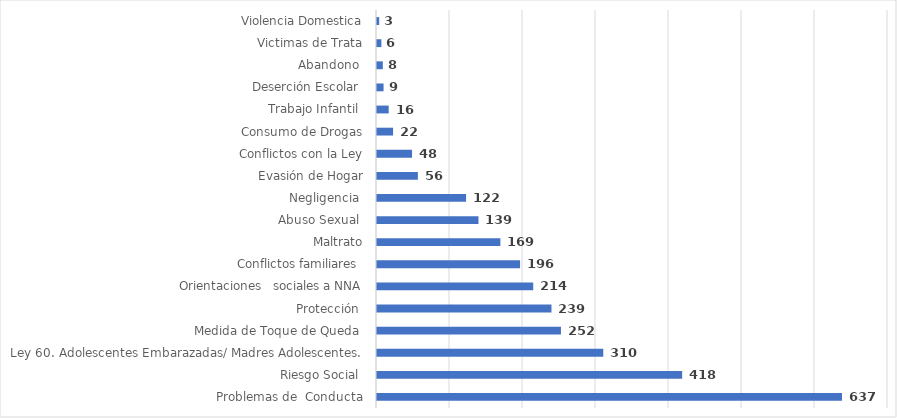
| Category | Series 0 |
|---|---|
| Problemas de  Conducta | 637 |
| Riesgo Social  | 418 |
| Ley 60. Adolescentes Embarazadas/ Madres Adolescentes. | 310 |
| Medida de Toque de Queda  | 252 |
| Protección  | 239 |
| Orientaciones   sociales a NNA | 214 |
| Conflictos familiares  | 196 |
| Maltrato | 169 |
| Abuso Sexual  | 139 |
| Negligencia  | 122 |
| Evasión de Hogar | 56 |
| Conflictos con la Ley | 48 |
| Consumo de Drogas | 22 |
| Trabajo Infantil  | 16 |
| Deserción Escolar  | 9 |
| Abandono  | 8 |
| Victimas de Trata | 6 |
| Violencia Domestica | 3 |